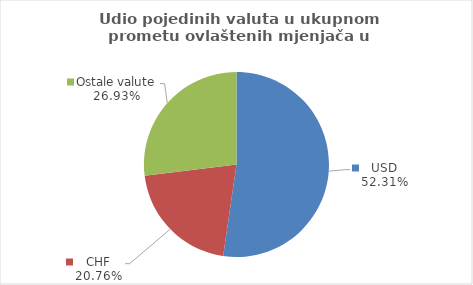
| Category | Series 0 |
|---|---|
| USD | 52.307 |
| CHF | 20.763 |
| Ostale valute | 26.93 |